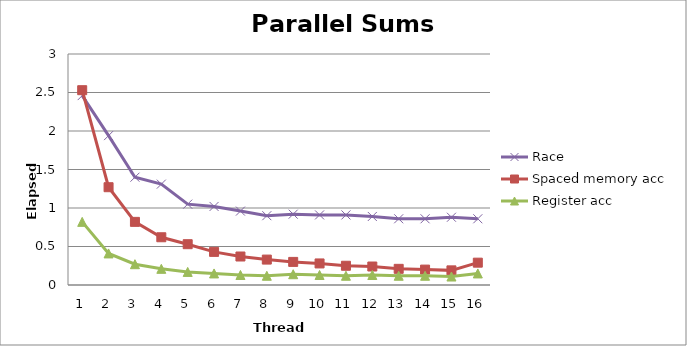
| Category | Race | Spaced memory acc | Register acc |
|---|---|---|---|
| 0 | 2.46 | 2.53 | 0.82 |
| 1 | 1.94 | 1.27 | 0.41 |
| 2 | 1.4 | 0.82 | 0.27 |
| 3 | 1.31 | 0.62 | 0.21 |
| 4 | 1.05 | 0.53 | 0.17 |
| 5 | 1.02 | 0.43 | 0.15 |
| 6 | 0.96 | 0.37 | 0.13 |
| 7 | 0.9 | 0.33 | 0.12 |
| 8 | 0.92 | 0.3 | 0.14 |
| 9 | 0.91 | 0.28 | 0.13 |
| 10 | 0.91 | 0.25 | 0.12 |
| 11 | 0.89 | 0.24 | 0.13 |
| 12 | 0.86 | 0.21 | 0.12 |
| 13 | 0.86 | 0.2 | 0.12 |
| 14 | 0.88 | 0.19 | 0.11 |
| 15 | 0.86 | 0.29 | 0.15 |